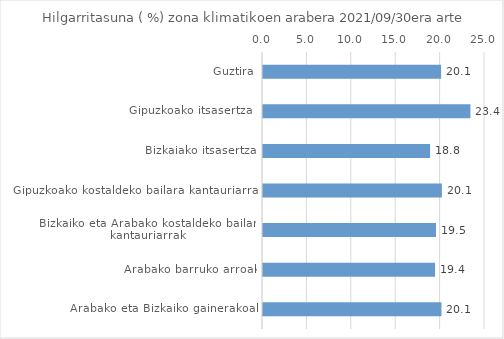
| Category | Series 0 |
|---|---|
| Guztira | 20.055 |
| Gipuzkoako itsasertza
 | 23.358 |
| Bizkaiako itsasertza | 18.818 |
| Gipuzkoako kostaldeko bailara kantauriarrak | 20.142 |
| Bizkaiko eta Arabako kostaldeko bailara kantauriarrak | 19.483 |
| Arabako barruko arroak | 19.377 |
| Arabako eta Bizkaiko gainerakoak | 20.095 |